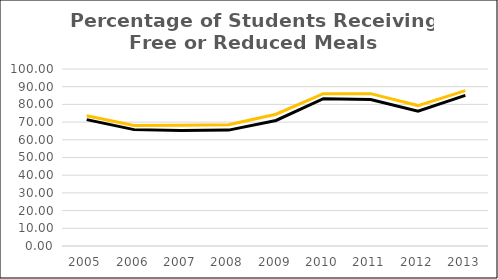
| Category | Percentage of Students Receiving Free or Reduced Meals |
|---|---|
| 2005.0 | 71.407 |
| 2006.0 | 65.747 |
| 2007.0 | 65.215 |
| 2008.0 | 65.467 |
| 2009.0 | 70.915 |
| 2010.0 | 83.215 |
| 2011.0 | 82.78 |
| 2012.0 | 76.18 |
| 2013.0 | 85.094 |